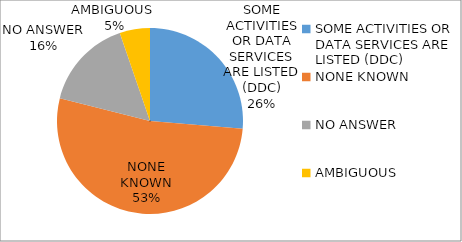
| Category | Series 0 |
|---|---|
| SOME ACTIVITIES OR DATA SERVICES ARE LISTED (DDC) | 0.263 |
| NONE KNOWN | 0.526 |
| NO ANSWER | 0.158 |
| AMBIGUOUS  | 0.053 |